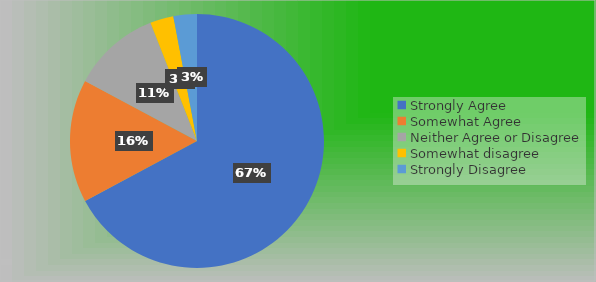
| Category | Series 0 |
|---|---|
| Strongly Agree | 90 |
| Somewhat Agree | 21 |
| Neither Agree or Disagree | 15 |
| Somewhat disagree | 4 |
| Strongly Disagree | 4 |